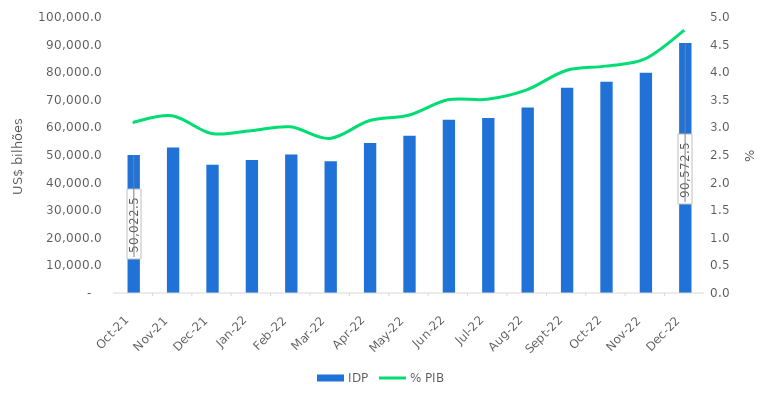
| Category | IDP |
|---|---|
| 2021-10-01 | 50022.5 |
| 2021-11-01 | 52720.6 |
| 2021-12-01 | 46439 |
| 2022-01-01 | 48145.8 |
| 2022-02-01 | 50201.3 |
| 2022-03-01 | 47711.5 |
| 2022-04-01 | 54313.5 |
| 2022-05-01 | 56979.1 |
| 2022-06-01 | 62732.9 |
| 2022-07-01 | 63384.5 |
| 2022-08-01 | 67208.2 |
| 2022-09-01 | 74349.9 |
| 2022-10-01 | 76516 |
| 2022-11-01 | 79823.1 |
| 2022-12-01 | 90572.5 |